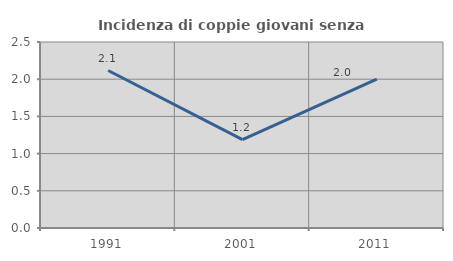
| Category | Incidenza di coppie giovani senza figli |
|---|---|
| 1991.0 | 2.116 |
| 2001.0 | 1.187 |
| 2011.0 | 2 |